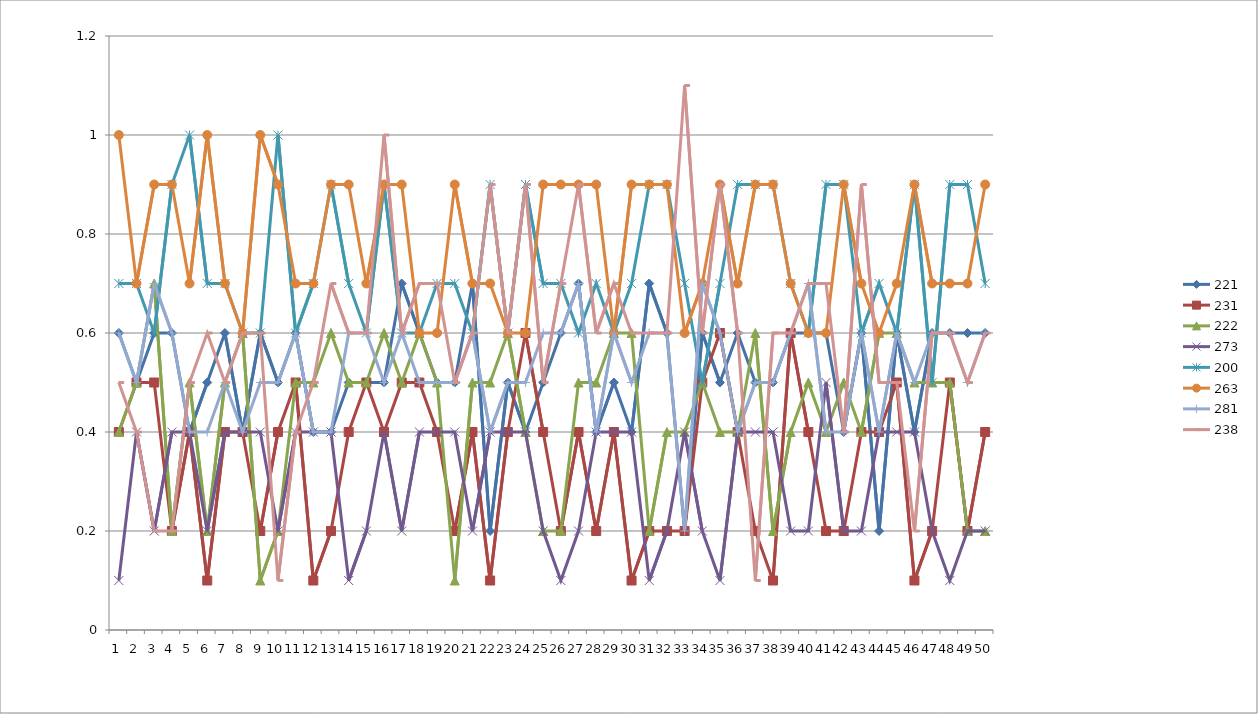
| Category | 221 | 231 | 222 | 273 | 200 | 263 | 281 | 238 |
|---|---|---|---|---|---|---|---|---|
| 0 | 0.6 | 0.4 | 0.4 | 0.1 | 0.7 | 1 | 0.6 | 0.5 |
| 1 | 0.5 | 0.5 | 0.5 | 0.4 | 0.7 | 0.7 | 0.5 | 0.4 |
| 2 | 0.6 | 0.5 | 0.7 | 0.2 | 0.6 | 0.9 | 0.7 | 0.2 |
| 3 | 0.6 | 0.2 | 0.2 | 0.4 | 0.9 | 0.9 | 0.6 | 0.2 |
| 4 | 0.4 | 0.4 | 0.5 | 0.4 | 1 | 0.7 | 0.4 | 0.5 |
| 5 | 0.5 | 0.1 | 0.2 | 0.2 | 0.7 | 1 | 0.4 | 0.6 |
| 6 | 0.6 | 0.4 | 0.5 | 0.4 | 0.7 | 0.7 | 0.5 | 0.5 |
| 7 | 0.4 | 0.4 | 0.6 | 0.4 | 0.6 | 0.6 | 0.4 | 0.6 |
| 8 | 0.6 | 0.2 | 0.1 | 0.4 | 0.6 | 1 | 0.5 | 0.6 |
| 9 | 0.5 | 0.4 | 0.2 | 0.2 | 1 | 0.9 | 0.5 | 0.1 |
| 10 | 0.6 | 0.5 | 0.5 | 0.4 | 0.6 | 0.7 | 0.6 | 0.4 |
| 11 | 0.4 | 0.1 | 0.5 | 0.4 | 0.7 | 0.7 | 0.4 | 0.5 |
| 12 | 0.4 | 0.2 | 0.6 | 0.4 | 0.9 | 0.9 | 0.4 | 0.7 |
| 13 | 0.5 | 0.4 | 0.5 | 0.1 | 0.7 | 0.9 | 0.6 | 0.6 |
| 14 | 0.5 | 0.5 | 0.5 | 0.2 | 0.6 | 0.7 | 0.6 | 0.6 |
| 15 | 0.5 | 0.4 | 0.6 | 0.4 | 0.9 | 0.9 | 0.5 | 1 |
| 16 | 0.7 | 0.5 | 0.5 | 0.2 | 0.6 | 0.9 | 0.6 | 0.6 |
| 17 | 0.6 | 0.5 | 0.6 | 0.4 | 0.6 | 0.6 | 0.5 | 0.7 |
| 18 | 0.5 | 0.4 | 0.5 | 0.4 | 0.7 | 0.6 | 0.5 | 0.7 |
| 19 | 0.5 | 0.2 | 0.1 | 0.4 | 0.7 | 0.9 | 0.5 | 0.5 |
| 20 | 0.7 | 0.4 | 0.5 | 0.2 | 0.6 | 0.7 | 0.6 | 0.6 |
| 21 | 0.2 | 0.1 | 0.5 | 0.4 | 0.9 | 0.7 | 0.4 | 0.9 |
| 22 | 0.5 | 0.4 | 0.6 | 0.4 | 0.6 | 0.6 | 0.5 | 0.6 |
| 23 | 0.4 | 0.6 | 0.4 | 0.4 | 0.9 | 0.6 | 0.5 | 0.9 |
| 24 | 0.5 | 0.4 | 0.2 | 0.2 | 0.7 | 0.9 | 0.6 | 0.5 |
| 25 | 0.6 | 0.2 | 0.2 | 0.1 | 0.7 | 0.9 | 0.6 | 0.7 |
| 26 | 0.7 | 0.4 | 0.5 | 0.2 | 0.6 | 0.9 | 0.7 | 0.9 |
| 27 | 0.4 | 0.2 | 0.5 | 0.4 | 0.7 | 0.9 | 0.4 | 0.6 |
| 28 | 0.5 | 0.4 | 0.6 | 0.4 | 0.6 | 0.6 | 0.6 | 0.7 |
| 29 | 0.4 | 0.1 | 0.6 | 0.4 | 0.7 | 0.9 | 0.5 | 0.6 |
| 30 | 0.7 | 0.2 | 0.2 | 0.1 | 0.9 | 0.9 | 0.6 | 0.6 |
| 31 | 0.6 | 0.2 | 0.4 | 0.2 | 0.9 | 0.9 | 0.6 | 0.6 |
| 32 | 0.2 | 0.2 | 0.4 | 0.4 | 0.7 | 0.6 | 0.2 | 1.1 |
| 33 | 0.6 | 0.5 | 0.5 | 0.2 | 0.5 | 0.7 | 0.7 | 0.6 |
| 34 | 0.5 | 0.6 | 0.4 | 0.1 | 0.7 | 0.9 | 0.6 | 0.9 |
| 35 | 0.6 | 0.4 | 0.4 | 0.4 | 0.9 | 0.7 | 0.4 | 0.6 |
| 36 | 0.5 | 0.2 | 0.6 | 0.4 | 0.9 | 0.9 | 0.5 | 0.1 |
| 37 | 0.5 | 0.1 | 0.2 | 0.4 | 0.9 | 0.9 | 0.5 | 0.6 |
| 38 | 0.6 | 0.6 | 0.4 | 0.2 | 0.7 | 0.7 | 0.6 | 0.6 |
| 39 | 0.6 | 0.4 | 0.5 | 0.2 | 0.6 | 0.6 | 0.7 | 0.7 |
| 40 | 0.6 | 0.2 | 0.4 | 0.5 | 0.9 | 0.6 | 0.4 | 0.7 |
| 41 | 0.4 | 0.2 | 0.5 | 0.2 | 0.9 | 0.9 | 0.4 | 0.4 |
| 42 | 0.6 | 0.4 | 0.4 | 0.2 | 0.6 | 0.7 | 0.6 | 0.9 |
| 43 | 0.2 | 0.4 | 0.6 | 0.4 | 0.7 | 0.6 | 0.4 | 0.5 |
| 44 | 0.6 | 0.5 | 0.6 | 0.4 | 0.6 | 0.7 | 0.6 | 0.5 |
| 45 | 0.4 | 0.1 | 0.5 | 0.4 | 0.9 | 0.9 | 0.5 | 0.2 |
| 46 | 0.6 | 0.2 | 0.5 | 0.2 | 0.5 | 0.7 | 0.6 | 0.6 |
| 47 | 0.6 | 0.5 | 0.5 | 0.1 | 0.9 | 0.7 | 0.6 | 0.6 |
| 48 | 0.6 | 0.2 | 0.2 | 0.2 | 0.9 | 0.7 | 0.5 | 0.5 |
| 49 | 0.6 | 0.4 | 0.2 | 0.2 | 0.7 | 0.9 | 0.6 | 0.6 |